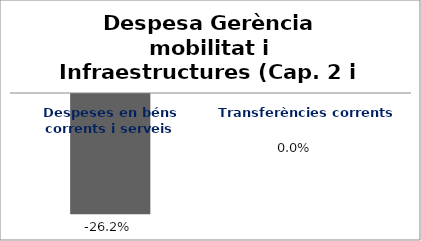
| Category | Series 0 |
|---|---|
| Despeses en béns corrents i serveis | -0.262 |
| Transferències corrents | 0 |